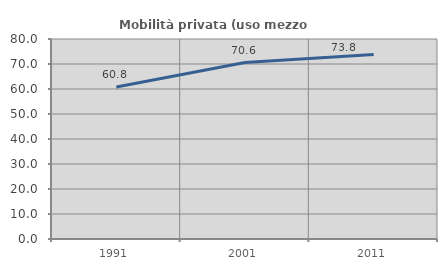
| Category | Mobilità privata (uso mezzo privato) |
|---|---|
| 1991.0 | 60.762 |
| 2001.0 | 70.583 |
| 2011.0 | 73.757 |